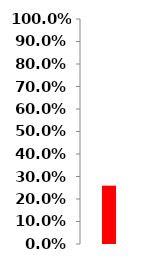
| Category | Series 0 |
|---|---|
| 0 | 0.259 |